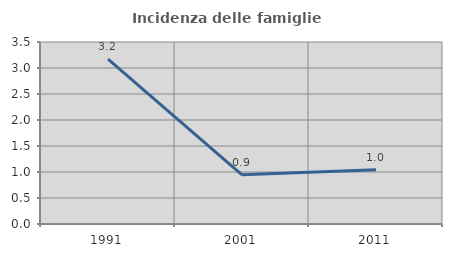
| Category | Incidenza delle famiglie numerose |
|---|---|
| 1991.0 | 3.169 |
| 2001.0 | 0.945 |
| 2011.0 | 1.043 |